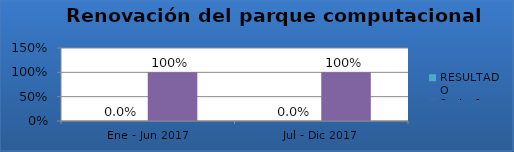
| Category | RESULTADO | Series 3 |
|---|---|---|
| Ene - Jun 2017 | 0 | 1 |
| Jul - Dic 2017 | 0 | 1 |